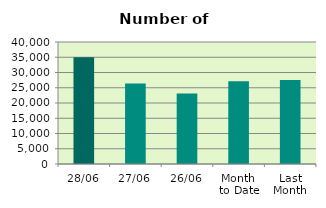
| Category | Series 0 |
|---|---|
| 28/06 | 35010 |
| 27/06 | 26354 |
| 26/06 | 23090 |
| Month 
to Date | 27125.1 |
| Last
Month | 27522.455 |